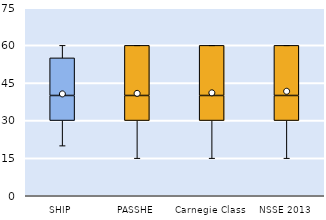
| Category | 25th | 50th | 75th |
|---|---|---|---|
| SHIP | 30 | 10 | 15 |
| PASSHE | 30 | 10 | 20 |
| Carnegie Class | 30 | 10 | 20 |
| NSSE 2013 | 30 | 10 | 20 |